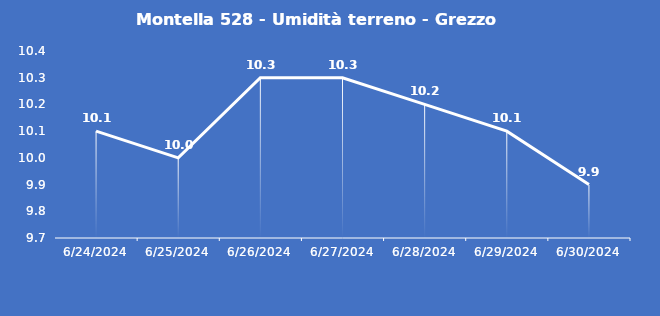
| Category | Montella 528 - Umidità terreno - Grezzo (%VWC) |
|---|---|
| 6/24/24 | 10.1 |
| 6/25/24 | 10 |
| 6/26/24 | 10.3 |
| 6/27/24 | 10.3 |
| 6/28/24 | 10.2 |
| 6/29/24 | 10.1 |
| 6/30/24 | 9.9 |